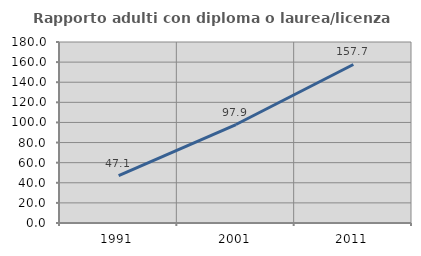
| Category | Rapporto adulti con diploma o laurea/licenza media  |
|---|---|
| 1991.0 | 47.143 |
| 2001.0 | 97.938 |
| 2011.0 | 157.658 |